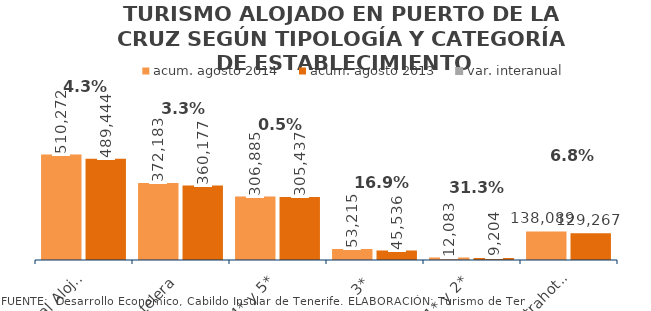
| Category | acum. agosto 2014 | acum. agosto 2013 |
|---|---|---|
| Total Alojados | 510272 | 489444 |
| Hotelera | 372183 | 360177 |
| 4* y 5* | 306885 | 305437 |
| 3* | 53215 | 45536 |
| 1* y 2* | 12083 | 9204 |
| Extrahotelera | 138089 | 129267 |